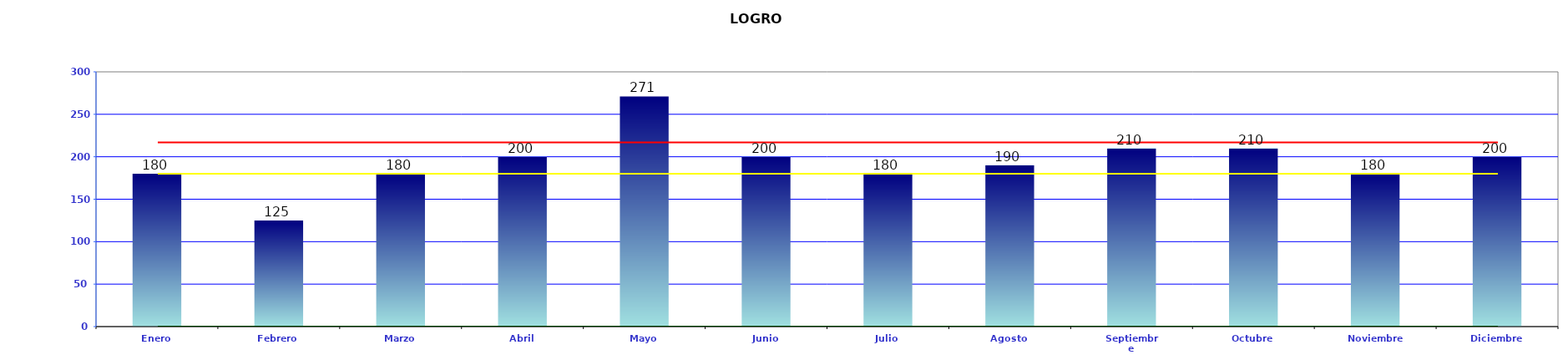
| Category | LOGROS |
|---|---|
| Enero | 180 |
| Febrero | 125 |
| Marzo | 180 |
| Abril | 200 |
| Mayo | 271 |
| Junio | 200 |
| Julio | 180 |
| Agosto | 190 |
| Septiembre | 210 |
| Octubre | 210 |
| Noviembre | 180 |
| Diciembre | 200 |